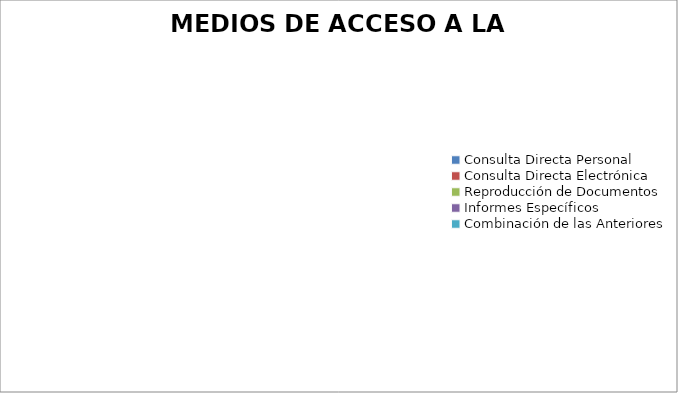
| Category | MEDIOS DE ACCESO A LA INFORMACIÓN |
|---|---|
| 0 | 0 |
| 1 | 0 |
| 2 | 0 |
| 3 | 0 |
| 4 | 0 |